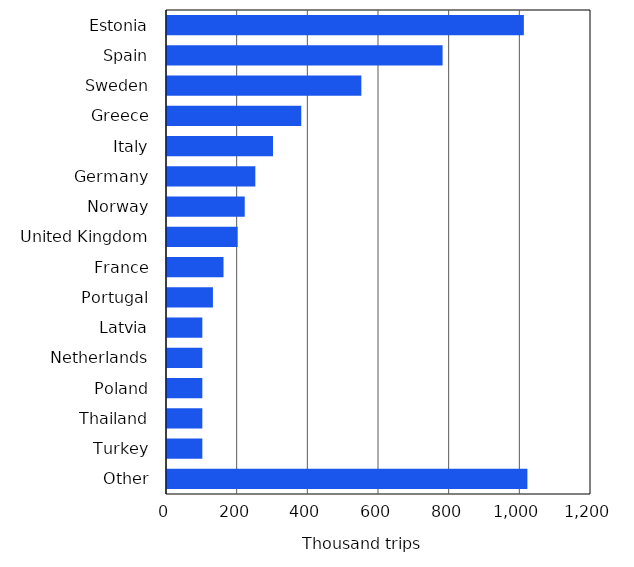
| Category | Thousand trips |
|---|---|
| Estonia | 1010 |
| Spain | 780 |
| Sweden | 550 |
| Greece | 380 |
| Italy | 300 |
| Germany | 250 |
| Norway | 220 |
| United Kingdom | 200 |
| France | 160 |
| Portugal | 130 |
| Latvia | 100 |
| Netherlands | 100 |
| Poland | 100 |
| Thailand | 100 |
| Turkey | 100 |
| Other | 1020 |